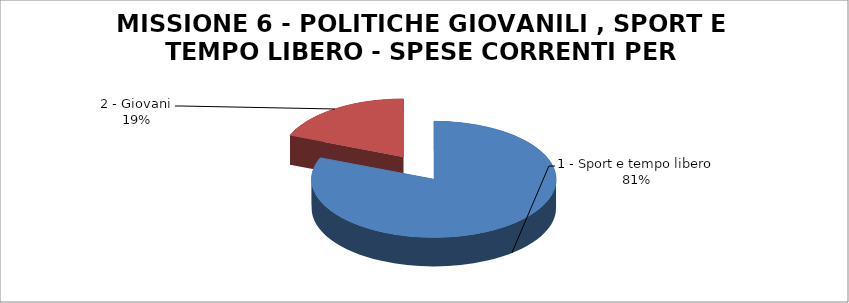
| Category | Series 0 |
|---|---|
| 1 - Sport e tempo libero | 937566 |
| 2 - Giovani | 219494 |